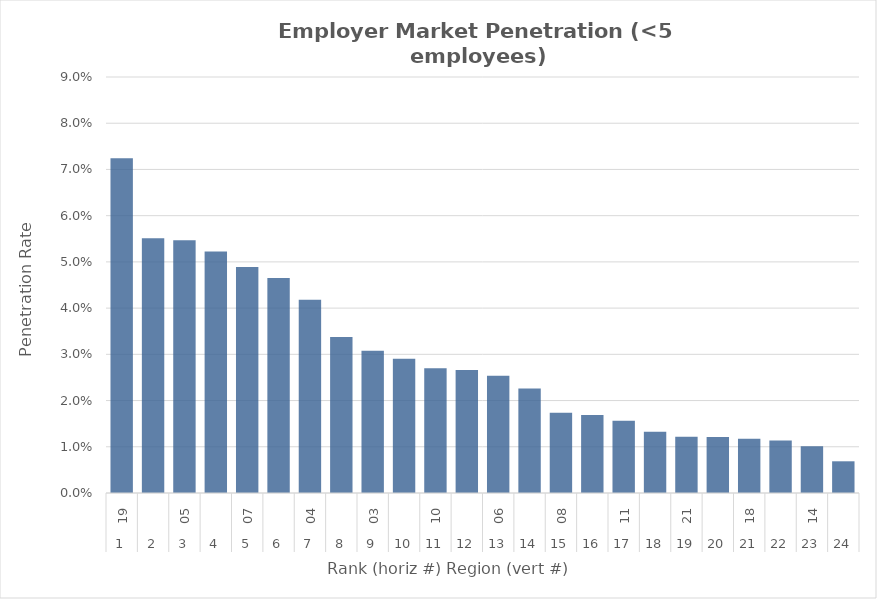
| Category | Rate |
|---|---|
| 0 | 0.072 |
| 1 | 0.055 |
| 2 | 0.055 |
| 3 | 0.052 |
| 4 | 0.049 |
| 5 | 0.047 |
| 6 | 0.042 |
| 7 | 0.034 |
| 8 | 0.031 |
| 9 | 0.029 |
| 10 | 0.027 |
| 11 | 0.027 |
| 12 | 0.025 |
| 13 | 0.023 |
| 14 | 0.017 |
| 15 | 0.017 |
| 16 | 0.016 |
| 17 | 0.013 |
| 18 | 0.012 |
| 19 | 0.012 |
| 20 | 0.012 |
| 21 | 0.011 |
| 22 | 0.01 |
| 23 | 0.007 |